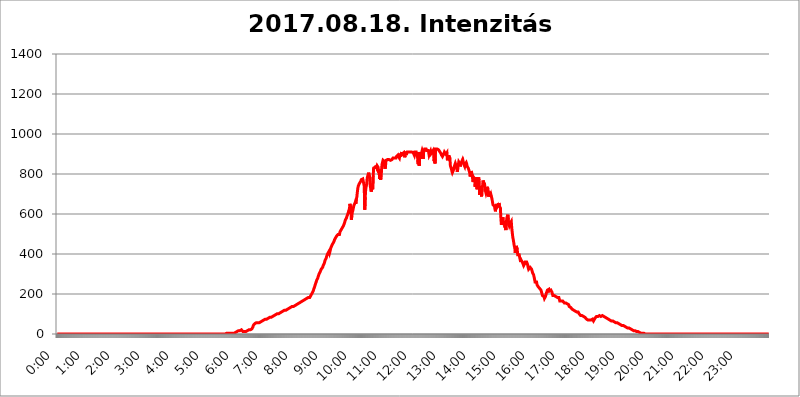
| Category | 2017.08.18. Intenzitás [W/m^2] |
|---|---|
| 0.0 | 0 |
| 0.0006944444444444445 | 0 |
| 0.001388888888888889 | 0 |
| 0.0020833333333333333 | 0 |
| 0.002777777777777778 | 0 |
| 0.003472222222222222 | 0 |
| 0.004166666666666667 | 0 |
| 0.004861111111111111 | 0 |
| 0.005555555555555556 | 0 |
| 0.0062499999999999995 | 0 |
| 0.006944444444444444 | 0 |
| 0.007638888888888889 | 0 |
| 0.008333333333333333 | 0 |
| 0.009027777777777779 | 0 |
| 0.009722222222222222 | 0 |
| 0.010416666666666666 | 0 |
| 0.011111111111111112 | 0 |
| 0.011805555555555555 | 0 |
| 0.012499999999999999 | 0 |
| 0.013194444444444444 | 0 |
| 0.013888888888888888 | 0 |
| 0.014583333333333332 | 0 |
| 0.015277777777777777 | 0 |
| 0.015972222222222224 | 0 |
| 0.016666666666666666 | 0 |
| 0.017361111111111112 | 0 |
| 0.018055555555555557 | 0 |
| 0.01875 | 0 |
| 0.019444444444444445 | 0 |
| 0.02013888888888889 | 0 |
| 0.020833333333333332 | 0 |
| 0.02152777777777778 | 0 |
| 0.022222222222222223 | 0 |
| 0.02291666666666667 | 0 |
| 0.02361111111111111 | 0 |
| 0.024305555555555556 | 0 |
| 0.024999999999999998 | 0 |
| 0.025694444444444447 | 0 |
| 0.02638888888888889 | 0 |
| 0.027083333333333334 | 0 |
| 0.027777777777777776 | 0 |
| 0.02847222222222222 | 0 |
| 0.029166666666666664 | 0 |
| 0.029861111111111113 | 0 |
| 0.030555555555555555 | 0 |
| 0.03125 | 0 |
| 0.03194444444444445 | 0 |
| 0.03263888888888889 | 0 |
| 0.03333333333333333 | 0 |
| 0.034027777777777775 | 0 |
| 0.034722222222222224 | 0 |
| 0.035416666666666666 | 0 |
| 0.036111111111111115 | 0 |
| 0.03680555555555556 | 0 |
| 0.0375 | 0 |
| 0.03819444444444444 | 0 |
| 0.03888888888888889 | 0 |
| 0.03958333333333333 | 0 |
| 0.04027777777777778 | 0 |
| 0.04097222222222222 | 0 |
| 0.041666666666666664 | 0 |
| 0.042361111111111106 | 0 |
| 0.04305555555555556 | 0 |
| 0.043750000000000004 | 0 |
| 0.044444444444444446 | 0 |
| 0.04513888888888889 | 0 |
| 0.04583333333333334 | 0 |
| 0.04652777777777778 | 0 |
| 0.04722222222222222 | 0 |
| 0.04791666666666666 | 0 |
| 0.04861111111111111 | 0 |
| 0.049305555555555554 | 0 |
| 0.049999999999999996 | 0 |
| 0.05069444444444445 | 0 |
| 0.051388888888888894 | 0 |
| 0.052083333333333336 | 0 |
| 0.05277777777777778 | 0 |
| 0.05347222222222222 | 0 |
| 0.05416666666666667 | 0 |
| 0.05486111111111111 | 0 |
| 0.05555555555555555 | 0 |
| 0.05625 | 0 |
| 0.05694444444444444 | 0 |
| 0.057638888888888885 | 0 |
| 0.05833333333333333 | 0 |
| 0.05902777777777778 | 0 |
| 0.059722222222222225 | 0 |
| 0.06041666666666667 | 0 |
| 0.061111111111111116 | 0 |
| 0.06180555555555556 | 0 |
| 0.0625 | 0 |
| 0.06319444444444444 | 0 |
| 0.06388888888888888 | 0 |
| 0.06458333333333334 | 0 |
| 0.06527777777777778 | 0 |
| 0.06597222222222222 | 0 |
| 0.06666666666666667 | 0 |
| 0.06736111111111111 | 0 |
| 0.06805555555555555 | 0 |
| 0.06874999999999999 | 0 |
| 0.06944444444444443 | 0 |
| 0.07013888888888889 | 0 |
| 0.07083333333333333 | 0 |
| 0.07152777777777779 | 0 |
| 0.07222222222222223 | 0 |
| 0.07291666666666667 | 0 |
| 0.07361111111111111 | 0 |
| 0.07430555555555556 | 0 |
| 0.075 | 0 |
| 0.07569444444444444 | 0 |
| 0.0763888888888889 | 0 |
| 0.07708333333333334 | 0 |
| 0.07777777777777778 | 0 |
| 0.07847222222222222 | 0 |
| 0.07916666666666666 | 0 |
| 0.0798611111111111 | 0 |
| 0.08055555555555556 | 0 |
| 0.08125 | 0 |
| 0.08194444444444444 | 0 |
| 0.08263888888888889 | 0 |
| 0.08333333333333333 | 0 |
| 0.08402777777777777 | 0 |
| 0.08472222222222221 | 0 |
| 0.08541666666666665 | 0 |
| 0.08611111111111112 | 0 |
| 0.08680555555555557 | 0 |
| 0.08750000000000001 | 0 |
| 0.08819444444444445 | 0 |
| 0.08888888888888889 | 0 |
| 0.08958333333333333 | 0 |
| 0.09027777777777778 | 0 |
| 0.09097222222222222 | 0 |
| 0.09166666666666667 | 0 |
| 0.09236111111111112 | 0 |
| 0.09305555555555556 | 0 |
| 0.09375 | 0 |
| 0.09444444444444444 | 0 |
| 0.09513888888888888 | 0 |
| 0.09583333333333333 | 0 |
| 0.09652777777777777 | 0 |
| 0.09722222222222222 | 0 |
| 0.09791666666666667 | 0 |
| 0.09861111111111111 | 0 |
| 0.09930555555555555 | 0 |
| 0.09999999999999999 | 0 |
| 0.10069444444444443 | 0 |
| 0.1013888888888889 | 0 |
| 0.10208333333333335 | 0 |
| 0.10277777777777779 | 0 |
| 0.10347222222222223 | 0 |
| 0.10416666666666667 | 0 |
| 0.10486111111111111 | 0 |
| 0.10555555555555556 | 0 |
| 0.10625 | 0 |
| 0.10694444444444444 | 0 |
| 0.1076388888888889 | 0 |
| 0.10833333333333334 | 0 |
| 0.10902777777777778 | 0 |
| 0.10972222222222222 | 0 |
| 0.1111111111111111 | 0 |
| 0.11180555555555556 | 0 |
| 0.11180555555555556 | 0 |
| 0.1125 | 0 |
| 0.11319444444444444 | 0 |
| 0.11388888888888889 | 0 |
| 0.11458333333333333 | 0 |
| 0.11527777777777777 | 0 |
| 0.11597222222222221 | 0 |
| 0.11666666666666665 | 0 |
| 0.1173611111111111 | 0 |
| 0.11805555555555557 | 0 |
| 0.11944444444444445 | 0 |
| 0.12013888888888889 | 0 |
| 0.12083333333333333 | 0 |
| 0.12152777777777778 | 0 |
| 0.12222222222222223 | 0 |
| 0.12291666666666667 | 0 |
| 0.12291666666666667 | 0 |
| 0.12361111111111112 | 0 |
| 0.12430555555555556 | 0 |
| 0.125 | 0 |
| 0.12569444444444444 | 0 |
| 0.12638888888888888 | 0 |
| 0.12708333333333333 | 0 |
| 0.16875 | 0 |
| 0.12847222222222224 | 0 |
| 0.12916666666666668 | 0 |
| 0.12986111111111112 | 0 |
| 0.13055555555555556 | 0 |
| 0.13125 | 0 |
| 0.13194444444444445 | 0 |
| 0.1326388888888889 | 0 |
| 0.13333333333333333 | 0 |
| 0.13402777777777777 | 0 |
| 0.13402777777777777 | 0 |
| 0.13472222222222222 | 0 |
| 0.13541666666666666 | 0 |
| 0.1361111111111111 | 0 |
| 0.13749999999999998 | 0 |
| 0.13819444444444443 | 0 |
| 0.1388888888888889 | 0 |
| 0.13958333333333334 | 0 |
| 0.14027777777777778 | 0 |
| 0.14097222222222222 | 0 |
| 0.14166666666666666 | 0 |
| 0.1423611111111111 | 0 |
| 0.14305555555555557 | 0 |
| 0.14375000000000002 | 0 |
| 0.14444444444444446 | 0 |
| 0.1451388888888889 | 0 |
| 0.1451388888888889 | 0 |
| 0.14652777777777778 | 0 |
| 0.14722222222222223 | 0 |
| 0.14791666666666667 | 0 |
| 0.1486111111111111 | 0 |
| 0.14930555555555555 | 0 |
| 0.15 | 0 |
| 0.15069444444444444 | 0 |
| 0.15138888888888888 | 0 |
| 0.15208333333333332 | 0 |
| 0.15277777777777776 | 0 |
| 0.15347222222222223 | 0 |
| 0.15416666666666667 | 0 |
| 0.15486111111111112 | 0 |
| 0.15555555555555556 | 0 |
| 0.15625 | 0 |
| 0.15694444444444444 | 0 |
| 0.15763888888888888 | 0 |
| 0.15833333333333333 | 0 |
| 0.15902777777777777 | 0 |
| 0.15972222222222224 | 0 |
| 0.16041666666666668 | 0 |
| 0.16111111111111112 | 0 |
| 0.16180555555555556 | 0 |
| 0.1625 | 0 |
| 0.16319444444444445 | 0 |
| 0.1638888888888889 | 0 |
| 0.16458333333333333 | 0 |
| 0.16527777777777777 | 0 |
| 0.16597222222222222 | 0 |
| 0.16666666666666666 | 0 |
| 0.1673611111111111 | 0 |
| 0.16805555555555554 | 0 |
| 0.16874999999999998 | 0 |
| 0.16944444444444443 | 0 |
| 0.17013888888888887 | 0 |
| 0.1708333333333333 | 0 |
| 0.17152777777777775 | 0 |
| 0.17222222222222225 | 0 |
| 0.1729166666666667 | 0 |
| 0.17361111111111113 | 0 |
| 0.17430555555555557 | 0 |
| 0.17500000000000002 | 0 |
| 0.17569444444444446 | 0 |
| 0.1763888888888889 | 0 |
| 0.17708333333333334 | 0 |
| 0.17777777777777778 | 0 |
| 0.17847222222222223 | 0 |
| 0.17916666666666667 | 0 |
| 0.1798611111111111 | 0 |
| 0.18055555555555555 | 0 |
| 0.18125 | 0 |
| 0.18194444444444444 | 0 |
| 0.1826388888888889 | 0 |
| 0.18333333333333335 | 0 |
| 0.1840277777777778 | 0 |
| 0.18472222222222223 | 0 |
| 0.18541666666666667 | 0 |
| 0.18611111111111112 | 0 |
| 0.18680555555555556 | 0 |
| 0.1875 | 0 |
| 0.18819444444444444 | 0 |
| 0.18888888888888888 | 0 |
| 0.18958333333333333 | 0 |
| 0.19027777777777777 | 0 |
| 0.1909722222222222 | 0 |
| 0.19166666666666665 | 0 |
| 0.19236111111111112 | 0 |
| 0.19305555555555554 | 0 |
| 0.19375 | 0 |
| 0.19444444444444445 | 0 |
| 0.1951388888888889 | 0 |
| 0.19583333333333333 | 0 |
| 0.19652777777777777 | 0 |
| 0.19722222222222222 | 0 |
| 0.19791666666666666 | 0 |
| 0.1986111111111111 | 0 |
| 0.19930555555555554 | 0 |
| 0.19999999999999998 | 0 |
| 0.20069444444444443 | 0 |
| 0.20138888888888887 | 0 |
| 0.2020833333333333 | 0 |
| 0.2027777777777778 | 0 |
| 0.2034722222222222 | 0 |
| 0.2041666666666667 | 0 |
| 0.20486111111111113 | 0 |
| 0.20555555555555557 | 0 |
| 0.20625000000000002 | 0 |
| 0.20694444444444446 | 0 |
| 0.2076388888888889 | 0 |
| 0.20833333333333334 | 0 |
| 0.20902777777777778 | 0 |
| 0.20972222222222223 | 0 |
| 0.21041666666666667 | 0 |
| 0.2111111111111111 | 0 |
| 0.21180555555555555 | 0 |
| 0.2125 | 0 |
| 0.21319444444444444 | 0 |
| 0.2138888888888889 | 0 |
| 0.21458333333333335 | 0 |
| 0.2152777777777778 | 0 |
| 0.21597222222222223 | 0 |
| 0.21666666666666667 | 0 |
| 0.21736111111111112 | 0 |
| 0.21805555555555556 | 0 |
| 0.21875 | 0 |
| 0.21944444444444444 | 0 |
| 0.22013888888888888 | 0 |
| 0.22083333333333333 | 0 |
| 0.22152777777777777 | 0 |
| 0.2222222222222222 | 0 |
| 0.22291666666666665 | 0 |
| 0.2236111111111111 | 0 |
| 0.22430555555555556 | 0 |
| 0.225 | 0 |
| 0.22569444444444445 | 0 |
| 0.2263888888888889 | 0 |
| 0.22708333333333333 | 0 |
| 0.22777777777777777 | 0 |
| 0.22847222222222222 | 0 |
| 0.22916666666666666 | 0 |
| 0.2298611111111111 | 0 |
| 0.23055555555555554 | 0 |
| 0.23124999999999998 | 0 |
| 0.23194444444444443 | 0 |
| 0.23263888888888887 | 0 |
| 0.2333333333333333 | 0 |
| 0.2340277777777778 | 0 |
| 0.2347222222222222 | 0 |
| 0.2354166666666667 | 0 |
| 0.23611111111111113 | 0 |
| 0.23680555555555557 | 0 |
| 0.23750000000000002 | 3.525 |
| 0.23819444444444446 | 3.525 |
| 0.2388888888888889 | 3.525 |
| 0.23958333333333334 | 3.525 |
| 0.24027777777777778 | 3.525 |
| 0.24097222222222223 | 3.525 |
| 0.24166666666666667 | 3.525 |
| 0.2423611111111111 | 3.525 |
| 0.24305555555555555 | 3.525 |
| 0.24375 | 3.525 |
| 0.24444444444444446 | 3.525 |
| 0.24513888888888888 | 3.525 |
| 0.24583333333333335 | 3.525 |
| 0.2465277777777778 | 3.525 |
| 0.24722222222222223 | 3.525 |
| 0.24791666666666667 | 3.525 |
| 0.24861111111111112 | 7.887 |
| 0.24930555555555556 | 7.887 |
| 0.25 | 7.887 |
| 0.25069444444444444 | 12.257 |
| 0.2513888888888889 | 12.257 |
| 0.2520833333333333 | 12.257 |
| 0.25277777777777777 | 12.257 |
| 0.2534722222222222 | 12.257 |
| 0.25416666666666665 | 16.636 |
| 0.2548611111111111 | 16.636 |
| 0.2555555555555556 | 16.636 |
| 0.25625000000000003 | 16.636 |
| 0.2569444444444445 | 16.636 |
| 0.2576388888888889 | 21.024 |
| 0.25833333333333336 | 21.024 |
| 0.2590277777777778 | 21.024 |
| 0.25972222222222224 | 16.636 |
| 0.2604166666666667 | 12.257 |
| 0.2611111111111111 | 12.257 |
| 0.26180555555555557 | 12.257 |
| 0.2625 | 12.257 |
| 0.26319444444444445 | 12.257 |
| 0.2638888888888889 | 12.257 |
| 0.26458333333333334 | 12.257 |
| 0.2652777777777778 | 16.636 |
| 0.2659722222222222 | 16.636 |
| 0.26666666666666666 | 16.636 |
| 0.2673611111111111 | 16.636 |
| 0.26805555555555555 | 21.024 |
| 0.26875 | 21.024 |
| 0.26944444444444443 | 21.024 |
| 0.2701388888888889 | 21.024 |
| 0.2708333333333333 | 21.024 |
| 0.27152777777777776 | 21.024 |
| 0.2722222222222222 | 21.024 |
| 0.27291666666666664 | 25.419 |
| 0.2736111111111111 | 29.823 |
| 0.2743055555555555 | 34.234 |
| 0.27499999999999997 | 43.079 |
| 0.27569444444444446 | 47.511 |
| 0.27638888888888885 | 47.511 |
| 0.27708333333333335 | 51.951 |
| 0.2777777777777778 | 51.951 |
| 0.27847222222222223 | 51.951 |
| 0.2791666666666667 | 56.398 |
| 0.2798611111111111 | 56.398 |
| 0.28055555555555556 | 56.398 |
| 0.28125 | 56.398 |
| 0.28194444444444444 | 56.398 |
| 0.2826388888888889 | 60.85 |
| 0.2833333333333333 | 56.398 |
| 0.28402777777777777 | 56.398 |
| 0.2847222222222222 | 56.398 |
| 0.28541666666666665 | 60.85 |
| 0.28611111111111115 | 60.85 |
| 0.28680555555555554 | 65.31 |
| 0.28750000000000003 | 65.31 |
| 0.2881944444444445 | 69.775 |
| 0.2888888888888889 | 69.775 |
| 0.28958333333333336 | 69.775 |
| 0.2902777777777778 | 69.775 |
| 0.29097222222222224 | 74.246 |
| 0.2916666666666667 | 74.246 |
| 0.2923611111111111 | 74.246 |
| 0.29305555555555557 | 74.246 |
| 0.29375 | 74.246 |
| 0.29444444444444445 | 78.722 |
| 0.2951388888888889 | 78.722 |
| 0.29583333333333334 | 78.722 |
| 0.2965277777777778 | 78.722 |
| 0.2972222222222222 | 83.205 |
| 0.29791666666666666 | 83.205 |
| 0.2986111111111111 | 83.205 |
| 0.29930555555555555 | 83.205 |
| 0.3 | 83.205 |
| 0.30069444444444443 | 87.692 |
| 0.3013888888888889 | 87.692 |
| 0.3020833333333333 | 87.692 |
| 0.30277777777777776 | 92.184 |
| 0.3034722222222222 | 92.184 |
| 0.30416666666666664 | 92.184 |
| 0.3048611111111111 | 92.184 |
| 0.3055555555555555 | 96.682 |
| 0.30624999999999997 | 96.682 |
| 0.3069444444444444 | 96.682 |
| 0.3076388888888889 | 96.682 |
| 0.30833333333333335 | 101.184 |
| 0.3090277777777778 | 101.184 |
| 0.30972222222222223 | 101.184 |
| 0.3104166666666667 | 101.184 |
| 0.3111111111111111 | 105.69 |
| 0.31180555555555556 | 105.69 |
| 0.3125 | 105.69 |
| 0.31319444444444444 | 105.69 |
| 0.3138888888888889 | 110.201 |
| 0.3145833333333333 | 110.201 |
| 0.31527777777777777 | 110.201 |
| 0.3159722222222222 | 110.201 |
| 0.31666666666666665 | 114.716 |
| 0.31736111111111115 | 114.716 |
| 0.31805555555555554 | 114.716 |
| 0.31875000000000003 | 119.235 |
| 0.3194444444444445 | 119.235 |
| 0.3201388888888889 | 119.235 |
| 0.32083333333333336 | 119.235 |
| 0.3215277777777778 | 123.758 |
| 0.32222222222222224 | 123.758 |
| 0.3229166666666667 | 123.758 |
| 0.3236111111111111 | 128.284 |
| 0.32430555555555557 | 128.284 |
| 0.325 | 128.284 |
| 0.32569444444444445 | 132.814 |
| 0.3263888888888889 | 132.814 |
| 0.32708333333333334 | 132.814 |
| 0.3277777777777778 | 132.814 |
| 0.3284722222222222 | 137.347 |
| 0.32916666666666666 | 137.347 |
| 0.3298611111111111 | 137.347 |
| 0.33055555555555555 | 137.347 |
| 0.33125 | 137.347 |
| 0.33194444444444443 | 141.884 |
| 0.3326388888888889 | 141.884 |
| 0.3333333333333333 | 141.884 |
| 0.3340277777777778 | 146.423 |
| 0.3347222222222222 | 146.423 |
| 0.3354166666666667 | 146.423 |
| 0.3361111111111111 | 146.423 |
| 0.3368055555555556 | 150.964 |
| 0.33749999999999997 | 150.964 |
| 0.33819444444444446 | 150.964 |
| 0.33888888888888885 | 155.509 |
| 0.33958333333333335 | 155.509 |
| 0.34027777777777773 | 155.509 |
| 0.34097222222222223 | 160.056 |
| 0.3416666666666666 | 160.056 |
| 0.3423611111111111 | 160.056 |
| 0.3430555555555555 | 164.605 |
| 0.34375 | 164.605 |
| 0.3444444444444445 | 164.605 |
| 0.3451388888888889 | 169.156 |
| 0.3458333333333334 | 169.156 |
| 0.34652777777777777 | 173.709 |
| 0.34722222222222227 | 173.709 |
| 0.34791666666666665 | 173.709 |
| 0.34861111111111115 | 173.709 |
| 0.34930555555555554 | 178.264 |
| 0.35000000000000003 | 178.264 |
| 0.3506944444444444 | 178.264 |
| 0.3513888888888889 | 182.82 |
| 0.3520833333333333 | 182.82 |
| 0.3527777777777778 | 182.82 |
| 0.3534722222222222 | 182.82 |
| 0.3541666666666667 | 182.82 |
| 0.3548611111111111 | 182.82 |
| 0.35555555555555557 | 187.378 |
| 0.35625 | 196.497 |
| 0.35694444444444445 | 201.058 |
| 0.3576388888888889 | 205.62 |
| 0.35833333333333334 | 210.182 |
| 0.3590277777777778 | 214.746 |
| 0.3597222222222222 | 223.873 |
| 0.36041666666666666 | 228.436 |
| 0.3611111111111111 | 237.564 |
| 0.36180555555555555 | 246.689 |
| 0.3625 | 251.251 |
| 0.36319444444444443 | 260.373 |
| 0.3638888888888889 | 269.49 |
| 0.3645833333333333 | 274.047 |
| 0.3652777777777778 | 278.603 |
| 0.3659722222222222 | 287.709 |
| 0.3666666666666667 | 292.259 |
| 0.3673611111111111 | 301.354 |
| 0.3680555555555556 | 305.898 |
| 0.36874999999999997 | 310.44 |
| 0.36944444444444446 | 314.98 |
| 0.37013888888888885 | 324.052 |
| 0.37083333333333335 | 324.052 |
| 0.37152777777777773 | 328.584 |
| 0.37222222222222223 | 333.113 |
| 0.3729166666666666 | 342.162 |
| 0.3736111111111111 | 346.682 |
| 0.3743055555555555 | 351.198 |
| 0.375 | 360.221 |
| 0.3756944444444445 | 369.23 |
| 0.3763888888888889 | 373.729 |
| 0.3770833333333334 | 378.224 |
| 0.37777777777777777 | 387.202 |
| 0.37847222222222227 | 391.685 |
| 0.37916666666666665 | 400.638 |
| 0.37986111111111115 | 405.108 |
| 0.38055555555555554 | 405.108 |
| 0.38125000000000003 | 414.035 |
| 0.3819444444444444 | 405.108 |
| 0.3826388888888889 | 414.035 |
| 0.3833333333333333 | 427.39 |
| 0.3840277777777778 | 427.39 |
| 0.3847222222222222 | 431.833 |
| 0.3854166666666667 | 445.129 |
| 0.3861111111111111 | 449.551 |
| 0.38680555555555557 | 453.968 |
| 0.3875 | 458.38 |
| 0.38819444444444445 | 462.786 |
| 0.3888888888888889 | 471.582 |
| 0.38958333333333334 | 471.582 |
| 0.3902777777777778 | 480.356 |
| 0.3909722222222222 | 484.735 |
| 0.39166666666666666 | 489.108 |
| 0.3923611111111111 | 489.108 |
| 0.39305555555555555 | 493.475 |
| 0.39375 | 497.836 |
| 0.39444444444444443 | 502.192 |
| 0.3951388888888889 | 502.192 |
| 0.3958333333333333 | 497.836 |
| 0.3965277777777778 | 510.885 |
| 0.3972222222222222 | 515.223 |
| 0.3979166666666667 | 519.555 |
| 0.3986111111111111 | 523.88 |
| 0.3993055555555556 | 523.88 |
| 0.39999999999999997 | 532.513 |
| 0.40069444444444446 | 536.82 |
| 0.40138888888888885 | 541.121 |
| 0.40208333333333335 | 545.416 |
| 0.40277777777777773 | 553.986 |
| 0.40347222222222223 | 562.53 |
| 0.4041666666666666 | 571.049 |
| 0.4048611111111111 | 571.049 |
| 0.4055555555555555 | 579.542 |
| 0.40625 | 588.009 |
| 0.4069444444444445 | 592.233 |
| 0.4076388888888889 | 600.661 |
| 0.4083333333333334 | 609.062 |
| 0.40902777777777777 | 600.661 |
| 0.40972222222222227 | 617.436 |
| 0.41041666666666665 | 650.667 |
| 0.41111111111111115 | 642.4 |
| 0.41180555555555554 | 634.105 |
| 0.41250000000000003 | 571.049 |
| 0.4131944444444444 | 592.233 |
| 0.4138888888888889 | 609.062 |
| 0.4145833333333333 | 617.436 |
| 0.4152777777777778 | 621.613 |
| 0.4159722222222222 | 642.4 |
| 0.4166666666666667 | 642.4 |
| 0.4173611111111111 | 638.256 |
| 0.41805555555555557 | 658.909 |
| 0.41875 | 650.667 |
| 0.41944444444444445 | 675.311 |
| 0.4201388888888889 | 683.473 |
| 0.42083333333333334 | 707.8 |
| 0.4215277777777778 | 727.896 |
| 0.4222222222222222 | 739.877 |
| 0.42291666666666666 | 743.859 |
| 0.4236111111111111 | 751.803 |
| 0.42430555555555555 | 751.803 |
| 0.425 | 755.766 |
| 0.42569444444444443 | 763.674 |
| 0.4263888888888889 | 771.559 |
| 0.4270833333333333 | 771.559 |
| 0.4277777777777778 | 767.62 |
| 0.4284722222222222 | 775.492 |
| 0.4291666666666667 | 779.42 |
| 0.4298611111111111 | 771.559 |
| 0.4305555555555556 | 739.877 |
| 0.43124999999999997 | 621.613 |
| 0.43194444444444446 | 683.473 |
| 0.43263888888888885 | 723.889 |
| 0.43333333333333335 | 723.889 |
| 0.43402777777777773 | 751.803 |
| 0.43472222222222223 | 779.42 |
| 0.4354166666666666 | 783.342 |
| 0.4361111111111111 | 798.974 |
| 0.4368055555555555 | 806.757 |
| 0.4375 | 802.868 |
| 0.4381944444444445 | 779.42 |
| 0.4388888888888889 | 743.859 |
| 0.4395833333333334 | 739.877 |
| 0.44027777777777777 | 711.832 |
| 0.44097222222222227 | 711.832 |
| 0.44166666666666665 | 731.896 |
| 0.44236111111111115 | 723.889 |
| 0.44305555555555554 | 787.258 |
| 0.44375000000000003 | 829.981 |
| 0.4444444444444444 | 826.123 |
| 0.4451388888888889 | 833.834 |
| 0.4458333333333333 | 833.834 |
| 0.4465277777777778 | 826.123 |
| 0.4472222222222222 | 841.526 |
| 0.4479166666666667 | 833.834 |
| 0.4486111111111111 | 841.526 |
| 0.44930555555555557 | 845.365 |
| 0.45 | 833.834 |
| 0.45069444444444445 | 806.757 |
| 0.4513888888888889 | 822.26 |
| 0.45208333333333334 | 775.492 |
| 0.4527777777777778 | 795.074 |
| 0.4534722222222222 | 771.559 |
| 0.45416666666666666 | 779.42 |
| 0.4548611111111111 | 822.26 |
| 0.45555555555555555 | 849.199 |
| 0.45625 | 853.029 |
| 0.45694444444444443 | 868.305 |
| 0.4576388888888889 | 868.305 |
| 0.4583333333333333 | 864.493 |
| 0.4590277777777778 | 860.676 |
| 0.4597222222222222 | 826.123 |
| 0.4604166666666667 | 841.526 |
| 0.4611111111111111 | 868.305 |
| 0.4618055555555556 | 872.114 |
| 0.46249999999999997 | 872.114 |
| 0.46319444444444446 | 872.114 |
| 0.46388888888888885 | 872.114 |
| 0.46458333333333335 | 872.114 |
| 0.46527777777777773 | 872.114 |
| 0.46597222222222223 | 872.114 |
| 0.4666666666666666 | 872.114 |
| 0.4673611111111111 | 868.305 |
| 0.4680555555555555 | 864.493 |
| 0.46875 | 868.305 |
| 0.4694444444444445 | 872.114 |
| 0.4701388888888889 | 872.114 |
| 0.4708333333333334 | 879.719 |
| 0.47152777777777777 | 879.719 |
| 0.47222222222222227 | 879.719 |
| 0.47291666666666665 | 879.719 |
| 0.47361111111111115 | 883.516 |
| 0.47430555555555554 | 883.516 |
| 0.47500000000000003 | 879.719 |
| 0.4756944444444444 | 887.309 |
| 0.4763888888888889 | 887.309 |
| 0.4770833333333333 | 891.099 |
| 0.4777777777777778 | 894.885 |
| 0.4784722222222222 | 887.309 |
| 0.4791666666666667 | 883.516 |
| 0.4798611111111111 | 879.719 |
| 0.48055555555555557 | 894.885 |
| 0.48125 | 887.309 |
| 0.48194444444444445 | 902.447 |
| 0.4826388888888889 | 894.885 |
| 0.48333333333333334 | 909.996 |
| 0.4840277777777778 | 898.668 |
| 0.4847222222222222 | 898.668 |
| 0.48541666666666666 | 898.668 |
| 0.4861111111111111 | 906.223 |
| 0.48680555555555555 | 898.668 |
| 0.4875 | 883.516 |
| 0.48819444444444443 | 906.223 |
| 0.4888888888888889 | 906.223 |
| 0.4895833333333333 | 909.996 |
| 0.4902777777777778 | 902.447 |
| 0.4909722222222222 | 909.996 |
| 0.4916666666666667 | 909.996 |
| 0.4923611111111111 | 909.996 |
| 0.4930555555555556 | 909.996 |
| 0.49374999999999997 | 909.996 |
| 0.49444444444444446 | 909.996 |
| 0.49513888888888885 | 909.996 |
| 0.49583333333333335 | 909.996 |
| 0.49652777777777773 | 909.996 |
| 0.49722222222222223 | 909.996 |
| 0.4979166666666666 | 909.996 |
| 0.4986111111111111 | 909.996 |
| 0.4993055555555555 | 906.223 |
| 0.5 | 902.447 |
| 0.5006944444444444 | 894.885 |
| 0.5013888888888889 | 909.996 |
| 0.5020833333333333 | 909.996 |
| 0.5027777777777778 | 913.766 |
| 0.5034722222222222 | 909.996 |
| 0.5041666666666667 | 898.668 |
| 0.5048611111111111 | 902.447 |
| 0.5055555555555555 | 909.996 |
| 0.50625 | 849.199 |
| 0.5069444444444444 | 906.223 |
| 0.5076388888888889 | 841.526 |
| 0.5083333333333333 | 894.885 |
| 0.5090277777777777 | 909.996 |
| 0.5097222222222222 | 875.918 |
| 0.5104166666666666 | 898.668 |
| 0.5111111111111112 | 898.668 |
| 0.5118055555555555 | 917.534 |
| 0.5125000000000001 | 909.996 |
| 0.5131944444444444 | 875.918 |
| 0.513888888888889 | 909.996 |
| 0.5145833333333333 | 917.534 |
| 0.5152777777777778 | 925.06 |
| 0.5159722222222222 | 928.819 |
| 0.5166666666666667 | 925.06 |
| 0.517361111111111 | 925.06 |
| 0.5180555555555556 | 917.534 |
| 0.5187499999999999 | 921.298 |
| 0.5194444444444445 | 917.534 |
| 0.5201388888888888 | 917.534 |
| 0.5208333333333334 | 909.996 |
| 0.5215277777777778 | 894.885 |
| 0.5222222222222223 | 898.668 |
| 0.5229166666666667 | 894.885 |
| 0.5236111111111111 | 913.766 |
| 0.5243055555555556 | 902.447 |
| 0.525 | 902.447 |
| 0.5256944444444445 | 909.996 |
| 0.5263888888888889 | 913.766 |
| 0.5270833333333333 | 917.534 |
| 0.5277777777777778 | 902.447 |
| 0.5284722222222222 | 864.493 |
| 0.5291666666666667 | 879.719 |
| 0.5298611111111111 | 853.029 |
| 0.5305555555555556 | 925.06 |
| 0.53125 | 928.819 |
| 0.5319444444444444 | 921.298 |
| 0.5326388888888889 | 925.06 |
| 0.5333333333333333 | 925.06 |
| 0.5340277777777778 | 925.06 |
| 0.5347222222222222 | 921.298 |
| 0.5354166666666667 | 917.534 |
| 0.5361111111111111 | 913.766 |
| 0.5368055555555555 | 909.996 |
| 0.5375 | 909.996 |
| 0.5381944444444444 | 902.447 |
| 0.5388888888888889 | 894.885 |
| 0.5395833333333333 | 894.885 |
| 0.5402777777777777 | 887.309 |
| 0.5409722222222222 | 883.516 |
| 0.5416666666666666 | 891.099 |
| 0.5423611111111112 | 902.447 |
| 0.5430555555555555 | 909.996 |
| 0.5437500000000001 | 909.996 |
| 0.5444444444444444 | 906.223 |
| 0.545138888888889 | 898.668 |
| 0.5458333333333333 | 898.668 |
| 0.5465277777777778 | 906.223 |
| 0.5472222222222222 | 868.305 |
| 0.5479166666666667 | 887.309 |
| 0.548611111111111 | 891.099 |
| 0.5493055555555556 | 887.309 |
| 0.5499999999999999 | 887.309 |
| 0.5506944444444445 | 879.719 |
| 0.5513888888888888 | 841.526 |
| 0.5520833333333334 | 837.682 |
| 0.5527777777777778 | 826.123 |
| 0.5534722222222223 | 814.519 |
| 0.5541666666666667 | 806.757 |
| 0.5548611111111111 | 802.868 |
| 0.5555555555555556 | 818.392 |
| 0.55625 | 826.123 |
| 0.5569444444444445 | 837.682 |
| 0.5576388888888889 | 841.526 |
| 0.5583333333333333 | 853.029 |
| 0.5590277777777778 | 845.365 |
| 0.5597222222222222 | 845.365 |
| 0.5604166666666667 | 833.834 |
| 0.5611111111111111 | 810.641 |
| 0.5618055555555556 | 829.981 |
| 0.5625 | 845.365 |
| 0.5631944444444444 | 860.676 |
| 0.5638888888888889 | 860.676 |
| 0.5645833333333333 | 853.029 |
| 0.5652777777777778 | 837.682 |
| 0.5659722222222222 | 849.199 |
| 0.5666666666666667 | 856.855 |
| 0.5673611111111111 | 856.855 |
| 0.5680555555555555 | 868.305 |
| 0.56875 | 853.029 |
| 0.5694444444444444 | 860.676 |
| 0.5701388888888889 | 849.199 |
| 0.5708333333333333 | 849.199 |
| 0.5715277777777777 | 837.682 |
| 0.5722222222222222 | 849.199 |
| 0.5729166666666666 | 845.365 |
| 0.5736111111111112 | 856.855 |
| 0.5743055555555555 | 849.199 |
| 0.5750000000000001 | 837.682 |
| 0.5756944444444444 | 837.682 |
| 0.576388888888889 | 829.981 |
| 0.5770833333333333 | 833.834 |
| 0.5777777777777778 | 826.123 |
| 0.5784722222222222 | 806.757 |
| 0.5791666666666667 | 787.258 |
| 0.579861111111111 | 798.974 |
| 0.5805555555555556 | 814.519 |
| 0.5812499999999999 | 806.757 |
| 0.5819444444444445 | 806.757 |
| 0.5826388888888888 | 802.868 |
| 0.5833333333333334 | 759.723 |
| 0.5840277777777778 | 783.342 |
| 0.5847222222222223 | 783.342 |
| 0.5854166666666667 | 775.492 |
| 0.5861111111111111 | 735.89 |
| 0.5868055555555556 | 767.62 |
| 0.5875 | 747.834 |
| 0.5881944444444445 | 783.342 |
| 0.5888888888888889 | 723.889 |
| 0.5895833333333333 | 759.723 |
| 0.5902777777777778 | 775.492 |
| 0.5909722222222222 | 783.342 |
| 0.5916666666666667 | 767.62 |
| 0.5923611111111111 | 695.666 |
| 0.5930555555555556 | 739.877 |
| 0.59375 | 731.896 |
| 0.5944444444444444 | 731.896 |
| 0.5951388888888889 | 687.544 |
| 0.5958333333333333 | 727.896 |
| 0.5965277777777778 | 739.877 |
| 0.5972222222222222 | 767.62 |
| 0.5979166666666667 | 759.723 |
| 0.5986111111111111 | 755.766 |
| 0.5993055555555555 | 751.803 |
| 0.6 | 723.889 |
| 0.6006944444444444 | 719.877 |
| 0.6013888888888889 | 703.762 |
| 0.6020833333333333 | 711.832 |
| 0.6027777777777777 | 699.717 |
| 0.6034722222222222 | 735.89 |
| 0.6041666666666666 | 739.877 |
| 0.6048611111111112 | 687.544 |
| 0.6055555555555555 | 699.717 |
| 0.6062500000000001 | 711.832 |
| 0.6069444444444444 | 711.832 |
| 0.607638888888889 | 687.544 |
| 0.6083333333333333 | 695.666 |
| 0.6090277777777778 | 695.666 |
| 0.6097222222222222 | 675.311 |
| 0.6104166666666667 | 675.311 |
| 0.611111111111111 | 646.537 |
| 0.6118055555555556 | 642.4 |
| 0.6124999999999999 | 650.667 |
| 0.6131944444444445 | 638.256 |
| 0.6138888888888888 | 642.4 |
| 0.6145833333333334 | 613.252 |
| 0.6152777777777778 | 638.256 |
| 0.6159722222222223 | 650.667 |
| 0.6166666666666667 | 634.105 |
| 0.6173611111111111 | 634.105 |
| 0.6180555555555556 | 642.4 |
| 0.61875 | 634.105 |
| 0.6194444444444445 | 654.791 |
| 0.6201388888888889 | 638.256 |
| 0.6208333333333333 | 642.4 |
| 0.6215277777777778 | 629.948 |
| 0.6222222222222222 | 579.542 |
| 0.6229166666666667 | 545.416 |
| 0.6236111111111111 | 558.261 |
| 0.6243055555555556 | 575.299 |
| 0.625 | 583.779 |
| 0.6256944444444444 | 549.704 |
| 0.6263888888888889 | 562.53 |
| 0.6270833333333333 | 553.986 |
| 0.6277777777777778 | 532.513 |
| 0.6284722222222222 | 541.121 |
| 0.6291666666666667 | 519.555 |
| 0.6298611111111111 | 558.261 |
| 0.6305555555555555 | 579.542 |
| 0.63125 | 588.009 |
| 0.6319444444444444 | 596.45 |
| 0.6326388888888889 | 571.049 |
| 0.6333333333333333 | 549.704 |
| 0.6340277777777777 | 541.121 |
| 0.6347222222222222 | 545.416 |
| 0.6354166666666666 | 553.986 |
| 0.6361111111111112 | 558.261 |
| 0.6368055555555555 | 562.53 |
| 0.6375000000000001 | 528.2 |
| 0.6381944444444444 | 506.542 |
| 0.638888888888889 | 484.735 |
| 0.6395833333333333 | 471.582 |
| 0.6402777777777778 | 471.582 |
| 0.6409722222222222 | 440.702 |
| 0.6416666666666667 | 431.833 |
| 0.642361111111111 | 405.108 |
| 0.6430555555555556 | 422.943 |
| 0.6437499999999999 | 440.702 |
| 0.6444444444444445 | 445.129 |
| 0.6451388888888888 | 422.943 |
| 0.6458333333333334 | 396.164 |
| 0.6465277777777778 | 396.164 |
| 0.6472222222222223 | 391.685 |
| 0.6479166666666667 | 396.164 |
| 0.6486111111111111 | 382.715 |
| 0.6493055555555556 | 387.202 |
| 0.65 | 360.221 |
| 0.6506944444444445 | 369.23 |
| 0.6513888888888889 | 369.23 |
| 0.6520833333333333 | 369.23 |
| 0.6527777777777778 | 355.712 |
| 0.6534722222222222 | 351.198 |
| 0.6541666666666667 | 342.162 |
| 0.6548611111111111 | 342.162 |
| 0.6555555555555556 | 351.198 |
| 0.65625 | 360.221 |
| 0.6569444444444444 | 355.712 |
| 0.6576388888888889 | 355.712 |
| 0.6583333333333333 | 360.221 |
| 0.6590277777777778 | 355.712 |
| 0.6597222222222222 | 346.682 |
| 0.6604166666666667 | 333.113 |
| 0.6611111111111111 | 324.052 |
| 0.6618055555555555 | 324.052 |
| 0.6625 | 324.052 |
| 0.6631944444444444 | 333.113 |
| 0.6638888888888889 | 333.113 |
| 0.6645833333333333 | 333.113 |
| 0.6652777777777777 | 324.052 |
| 0.6659722222222222 | 314.98 |
| 0.6666666666666666 | 305.898 |
| 0.6673611111111111 | 305.898 |
| 0.6680555555555556 | 296.808 |
| 0.6687500000000001 | 292.259 |
| 0.6694444444444444 | 274.047 |
| 0.6701388888888888 | 260.373 |
| 0.6708333333333334 | 255.813 |
| 0.6715277777777778 | 260.373 |
| 0.6722222222222222 | 260.373 |
| 0.6729166666666666 | 246.689 |
| 0.6736111111111112 | 242.127 |
| 0.6743055555555556 | 237.564 |
| 0.6749999999999999 | 233 |
| 0.6756944444444444 | 233 |
| 0.6763888888888889 | 228.436 |
| 0.6770833333333334 | 228.436 |
| 0.6777777777777777 | 233 |
| 0.6784722222222223 | 219.309 |
| 0.6791666666666667 | 210.182 |
| 0.6798611111111111 | 201.058 |
| 0.6805555555555555 | 191.937 |
| 0.68125 | 191.937 |
| 0.6819444444444445 | 187.378 |
| 0.6826388888888889 | 187.378 |
| 0.6833333333333332 | 178.264 |
| 0.6840277777777778 | 182.82 |
| 0.6847222222222222 | 187.378 |
| 0.6854166666666667 | 196.497 |
| 0.686111111111111 | 205.62 |
| 0.6868055555555556 | 210.182 |
| 0.6875 | 219.309 |
| 0.6881944444444444 | 219.309 |
| 0.688888888888889 | 223.873 |
| 0.6895833333333333 | 223.873 |
| 0.6902777777777778 | 214.746 |
| 0.6909722222222222 | 219.309 |
| 0.6916666666666668 | 219.309 |
| 0.6923611111111111 | 219.309 |
| 0.6930555555555555 | 219.309 |
| 0.69375 | 210.182 |
| 0.6944444444444445 | 201.058 |
| 0.6951388888888889 | 191.937 |
| 0.6958333333333333 | 196.497 |
| 0.6965277777777777 | 191.937 |
| 0.6972222222222223 | 191.937 |
| 0.6979166666666666 | 191.937 |
| 0.6986111111111111 | 191.937 |
| 0.6993055555555556 | 187.378 |
| 0.7000000000000001 | 187.378 |
| 0.7006944444444444 | 182.82 |
| 0.7013888888888888 | 182.82 |
| 0.7020833333333334 | 187.378 |
| 0.7027777777777778 | 187.378 |
| 0.7034722222222222 | 182.82 |
| 0.7041666666666666 | 173.709 |
| 0.7048611111111112 | 164.605 |
| 0.7055555555555556 | 169.156 |
| 0.7062499999999999 | 164.605 |
| 0.7069444444444444 | 164.605 |
| 0.7076388888888889 | 160.056 |
| 0.7083333333333334 | 164.605 |
| 0.7090277777777777 | 164.605 |
| 0.7097222222222223 | 160.056 |
| 0.7104166666666667 | 160.056 |
| 0.7111111111111111 | 155.509 |
| 0.7118055555555555 | 155.509 |
| 0.7125 | 155.509 |
| 0.7131944444444445 | 155.509 |
| 0.7138888888888889 | 155.509 |
| 0.7145833333333332 | 155.509 |
| 0.7152777777777778 | 150.964 |
| 0.7159722222222222 | 150.964 |
| 0.7166666666666667 | 146.423 |
| 0.717361111111111 | 146.423 |
| 0.7180555555555556 | 137.347 |
| 0.71875 | 137.347 |
| 0.7194444444444444 | 137.347 |
| 0.720138888888889 | 132.814 |
| 0.7208333333333333 | 132.814 |
| 0.7215277777777778 | 132.814 |
| 0.7222222222222222 | 123.758 |
| 0.7229166666666668 | 123.758 |
| 0.7236111111111111 | 119.235 |
| 0.7243055555555555 | 119.235 |
| 0.725 | 119.235 |
| 0.7256944444444445 | 119.235 |
| 0.7263888888888889 | 114.716 |
| 0.7270833333333333 | 114.716 |
| 0.7277777777777777 | 114.716 |
| 0.7284722222222223 | 110.201 |
| 0.7291666666666666 | 110.201 |
| 0.7298611111111111 | 110.201 |
| 0.7305555555555556 | 110.201 |
| 0.7312500000000001 | 105.69 |
| 0.7319444444444444 | 101.184 |
| 0.7326388888888888 | 101.184 |
| 0.7333333333333334 | 96.682 |
| 0.7340277777777778 | 92.184 |
| 0.7347222222222222 | 87.692 |
| 0.7354166666666666 | 87.692 |
| 0.7361111111111112 | 92.184 |
| 0.7368055555555556 | 92.184 |
| 0.7374999999999999 | 92.184 |
| 0.7381944444444444 | 87.692 |
| 0.7388888888888889 | 87.692 |
| 0.7395833333333334 | 83.205 |
| 0.7402777777777777 | 83.205 |
| 0.7409722222222223 | 83.205 |
| 0.7416666666666667 | 78.722 |
| 0.7423611111111111 | 74.246 |
| 0.7430555555555555 | 74.246 |
| 0.74375 | 69.775 |
| 0.7444444444444445 | 69.775 |
| 0.7451388888888889 | 69.775 |
| 0.7458333333333332 | 69.775 |
| 0.7465277777777778 | 69.775 |
| 0.7472222222222222 | 69.775 |
| 0.7479166666666667 | 65.31 |
| 0.748611111111111 | 69.775 |
| 0.7493055555555556 | 74.246 |
| 0.75 | 74.246 |
| 0.7506944444444444 | 74.246 |
| 0.751388888888889 | 69.775 |
| 0.7520833333333333 | 65.31 |
| 0.7527777777777778 | 65.31 |
| 0.7534722222222222 | 69.775 |
| 0.7541666666666668 | 78.722 |
| 0.7548611111111111 | 83.205 |
| 0.7555555555555555 | 83.205 |
| 0.75625 | 87.692 |
| 0.7569444444444445 | 87.692 |
| 0.7576388888888889 | 87.692 |
| 0.7583333333333333 | 87.692 |
| 0.7590277777777777 | 92.184 |
| 0.7597222222222223 | 92.184 |
| 0.7604166666666666 | 92.184 |
| 0.7611111111111111 | 92.184 |
| 0.7618055555555556 | 92.184 |
| 0.7625000000000001 | 87.692 |
| 0.7631944444444444 | 83.205 |
| 0.7638888888888888 | 87.692 |
| 0.7645833333333334 | 92.184 |
| 0.7652777777777778 | 87.692 |
| 0.7659722222222222 | 87.692 |
| 0.7666666666666666 | 87.692 |
| 0.7673611111111112 | 87.692 |
| 0.7680555555555556 | 83.205 |
| 0.7687499999999999 | 83.205 |
| 0.7694444444444444 | 83.205 |
| 0.7701388888888889 | 83.205 |
| 0.7708333333333334 | 78.722 |
| 0.7715277777777777 | 78.722 |
| 0.7722222222222223 | 78.722 |
| 0.7729166666666667 | 74.246 |
| 0.7736111111111111 | 74.246 |
| 0.7743055555555555 | 69.775 |
| 0.775 | 69.775 |
| 0.7756944444444445 | 65.31 |
| 0.7763888888888889 | 65.31 |
| 0.7770833333333332 | 65.31 |
| 0.7777777777777778 | 65.31 |
| 0.7784722222222222 | 65.31 |
| 0.7791666666666667 | 65.31 |
| 0.779861111111111 | 65.31 |
| 0.7805555555555556 | 60.85 |
| 0.78125 | 60.85 |
| 0.7819444444444444 | 60.85 |
| 0.782638888888889 | 60.85 |
| 0.7833333333333333 | 56.398 |
| 0.7840277777777778 | 56.398 |
| 0.7847222222222222 | 56.398 |
| 0.7854166666666668 | 56.398 |
| 0.7861111111111111 | 51.951 |
| 0.7868055555555555 | 51.951 |
| 0.7875 | 51.951 |
| 0.7881944444444445 | 47.511 |
| 0.7888888888888889 | 47.511 |
| 0.7895833333333333 | 47.511 |
| 0.7902777777777777 | 47.511 |
| 0.7909722222222223 | 47.511 |
| 0.7916666666666666 | 43.079 |
| 0.7923611111111111 | 43.079 |
| 0.7930555555555556 | 43.079 |
| 0.7937500000000001 | 43.079 |
| 0.7944444444444444 | 38.653 |
| 0.7951388888888888 | 38.653 |
| 0.7958333333333334 | 38.653 |
| 0.7965277777777778 | 38.653 |
| 0.7972222222222222 | 38.653 |
| 0.7979166666666666 | 34.234 |
| 0.7986111111111112 | 34.234 |
| 0.7993055555555556 | 34.234 |
| 0.7999999999999999 | 29.823 |
| 0.8006944444444444 | 29.823 |
| 0.8013888888888889 | 29.823 |
| 0.8020833333333334 | 29.823 |
| 0.8027777777777777 | 29.823 |
| 0.8034722222222223 | 25.419 |
| 0.8041666666666667 | 25.419 |
| 0.8048611111111111 | 25.419 |
| 0.8055555555555555 | 21.024 |
| 0.80625 | 21.024 |
| 0.8069444444444445 | 21.024 |
| 0.8076388888888889 | 21.024 |
| 0.8083333333333332 | 16.636 |
| 0.8090277777777778 | 16.636 |
| 0.8097222222222222 | 16.636 |
| 0.8104166666666667 | 16.636 |
| 0.811111111111111 | 12.257 |
| 0.8118055555555556 | 12.257 |
| 0.8125 | 12.257 |
| 0.8131944444444444 | 12.257 |
| 0.813888888888889 | 12.257 |
| 0.8145833333333333 | 12.257 |
| 0.8152777777777778 | 7.887 |
| 0.8159722222222222 | 7.887 |
| 0.8166666666666668 | 7.887 |
| 0.8173611111111111 | 7.887 |
| 0.8180555555555555 | 7.887 |
| 0.81875 | 3.525 |
| 0.8194444444444445 | 3.525 |
| 0.8201388888888889 | 3.525 |
| 0.8208333333333333 | 3.525 |
| 0.8215277777777777 | 3.525 |
| 0.8222222222222223 | 3.525 |
| 0.8229166666666666 | 3.525 |
| 0.8236111111111111 | 0 |
| 0.8243055555555556 | 0 |
| 0.8250000000000001 | 0 |
| 0.8256944444444444 | 0 |
| 0.8263888888888888 | 0 |
| 0.8270833333333334 | 0 |
| 0.8277777777777778 | 0 |
| 0.8284722222222222 | 0 |
| 0.8291666666666666 | 0 |
| 0.8298611111111112 | 0 |
| 0.8305555555555556 | 0 |
| 0.8312499999999999 | 0 |
| 0.8319444444444444 | 0 |
| 0.8326388888888889 | 0 |
| 0.8333333333333334 | 0 |
| 0.8340277777777777 | 0 |
| 0.8347222222222223 | 0 |
| 0.8354166666666667 | 0 |
| 0.8361111111111111 | 0 |
| 0.8368055555555555 | 0 |
| 0.8375 | 0 |
| 0.8381944444444445 | 0 |
| 0.8388888888888889 | 0 |
| 0.8395833333333332 | 0 |
| 0.8402777777777778 | 0 |
| 0.8409722222222222 | 0 |
| 0.8416666666666667 | 0 |
| 0.842361111111111 | 0 |
| 0.8430555555555556 | 0 |
| 0.84375 | 0 |
| 0.8444444444444444 | 0 |
| 0.845138888888889 | 0 |
| 0.8458333333333333 | 0 |
| 0.8465277777777778 | 0 |
| 0.8472222222222222 | 0 |
| 0.8479166666666668 | 0 |
| 0.8486111111111111 | 0 |
| 0.8493055555555555 | 0 |
| 0.85 | 0 |
| 0.8506944444444445 | 0 |
| 0.8513888888888889 | 0 |
| 0.8520833333333333 | 0 |
| 0.8527777777777777 | 0 |
| 0.8534722222222223 | 0 |
| 0.8541666666666666 | 0 |
| 0.8548611111111111 | 0 |
| 0.8555555555555556 | 0 |
| 0.8562500000000001 | 0 |
| 0.8569444444444444 | 0 |
| 0.8576388888888888 | 0 |
| 0.8583333333333334 | 0 |
| 0.8590277777777778 | 0 |
| 0.8597222222222222 | 0 |
| 0.8604166666666666 | 0 |
| 0.8611111111111112 | 0 |
| 0.8618055555555556 | 0 |
| 0.8624999999999999 | 0 |
| 0.8631944444444444 | 0 |
| 0.8638888888888889 | 0 |
| 0.8645833333333334 | 0 |
| 0.8652777777777777 | 0 |
| 0.8659722222222223 | 0 |
| 0.8666666666666667 | 0 |
| 0.8673611111111111 | 0 |
| 0.8680555555555555 | 0 |
| 0.86875 | 0 |
| 0.8694444444444445 | 0 |
| 0.8701388888888889 | 0 |
| 0.8708333333333332 | 0 |
| 0.8715277777777778 | 0 |
| 0.8722222222222222 | 0 |
| 0.8729166666666667 | 0 |
| 0.873611111111111 | 0 |
| 0.8743055555555556 | 0 |
| 0.875 | 0 |
| 0.8756944444444444 | 0 |
| 0.876388888888889 | 0 |
| 0.8770833333333333 | 0 |
| 0.8777777777777778 | 0 |
| 0.8784722222222222 | 0 |
| 0.8791666666666668 | 0 |
| 0.8798611111111111 | 0 |
| 0.8805555555555555 | 0 |
| 0.88125 | 0 |
| 0.8819444444444445 | 0 |
| 0.8826388888888889 | 0 |
| 0.8833333333333333 | 0 |
| 0.8840277777777777 | 0 |
| 0.8847222222222223 | 0 |
| 0.8854166666666666 | 0 |
| 0.8861111111111111 | 0 |
| 0.8868055555555556 | 0 |
| 0.8875000000000001 | 0 |
| 0.8881944444444444 | 0 |
| 0.8888888888888888 | 0 |
| 0.8895833333333334 | 0 |
| 0.8902777777777778 | 0 |
| 0.8909722222222222 | 0 |
| 0.8916666666666666 | 0 |
| 0.8923611111111112 | 0 |
| 0.8930555555555556 | 0 |
| 0.8937499999999999 | 0 |
| 0.8944444444444444 | 0 |
| 0.8951388888888889 | 0 |
| 0.8958333333333334 | 0 |
| 0.8965277777777777 | 0 |
| 0.8972222222222223 | 0 |
| 0.8979166666666667 | 0 |
| 0.8986111111111111 | 0 |
| 0.8993055555555555 | 0 |
| 0.9 | 0 |
| 0.9006944444444445 | 0 |
| 0.9013888888888889 | 0 |
| 0.9020833333333332 | 0 |
| 0.9027777777777778 | 0 |
| 0.9034722222222222 | 0 |
| 0.9041666666666667 | 0 |
| 0.904861111111111 | 0 |
| 0.9055555555555556 | 0 |
| 0.90625 | 0 |
| 0.9069444444444444 | 0 |
| 0.907638888888889 | 0 |
| 0.9083333333333333 | 0 |
| 0.9090277777777778 | 0 |
| 0.9097222222222222 | 0 |
| 0.9104166666666668 | 0 |
| 0.9111111111111111 | 0 |
| 0.9118055555555555 | 0 |
| 0.9125 | 0 |
| 0.9131944444444445 | 0 |
| 0.9138888888888889 | 0 |
| 0.9145833333333333 | 0 |
| 0.9152777777777777 | 0 |
| 0.9159722222222223 | 0 |
| 0.9166666666666666 | 0 |
| 0.9173611111111111 | 0 |
| 0.9180555555555556 | 0 |
| 0.9187500000000001 | 0 |
| 0.9194444444444444 | 0 |
| 0.9201388888888888 | 0 |
| 0.9208333333333334 | 0 |
| 0.9215277777777778 | 0 |
| 0.9222222222222222 | 0 |
| 0.9229166666666666 | 0 |
| 0.9236111111111112 | 0 |
| 0.9243055555555556 | 0 |
| 0.9249999999999999 | 0 |
| 0.9256944444444444 | 0 |
| 0.9263888888888889 | 0 |
| 0.9270833333333334 | 0 |
| 0.9277777777777777 | 0 |
| 0.9284722222222223 | 0 |
| 0.9291666666666667 | 0 |
| 0.9298611111111111 | 0 |
| 0.9305555555555555 | 0 |
| 0.93125 | 0 |
| 0.9319444444444445 | 0 |
| 0.9326388888888889 | 0 |
| 0.9333333333333332 | 0 |
| 0.9340277777777778 | 0 |
| 0.9347222222222222 | 0 |
| 0.9354166666666667 | 0 |
| 0.936111111111111 | 0 |
| 0.9368055555555556 | 0 |
| 0.9375 | 0 |
| 0.9381944444444444 | 0 |
| 0.938888888888889 | 0 |
| 0.9395833333333333 | 0 |
| 0.9402777777777778 | 0 |
| 0.9409722222222222 | 0 |
| 0.9416666666666668 | 0 |
| 0.9423611111111111 | 0 |
| 0.9430555555555555 | 0 |
| 0.94375 | 0 |
| 0.9444444444444445 | 0 |
| 0.9451388888888889 | 0 |
| 0.9458333333333333 | 0 |
| 0.9465277777777777 | 0 |
| 0.9472222222222223 | 0 |
| 0.9479166666666666 | 0 |
| 0.9486111111111111 | 0 |
| 0.9493055555555556 | 0 |
| 0.9500000000000001 | 0 |
| 0.9506944444444444 | 0 |
| 0.9513888888888888 | 0 |
| 0.9520833333333334 | 0 |
| 0.9527777777777778 | 0 |
| 0.9534722222222222 | 0 |
| 0.9541666666666666 | 0 |
| 0.9548611111111112 | 0 |
| 0.9555555555555556 | 0 |
| 0.9562499999999999 | 0 |
| 0.9569444444444444 | 0 |
| 0.9576388888888889 | 0 |
| 0.9583333333333334 | 0 |
| 0.9590277777777777 | 0 |
| 0.9597222222222223 | 0 |
| 0.9604166666666667 | 0 |
| 0.9611111111111111 | 0 |
| 0.9618055555555555 | 0 |
| 0.9625 | 0 |
| 0.9631944444444445 | 0 |
| 0.9638888888888889 | 0 |
| 0.9645833333333332 | 0 |
| 0.9652777777777778 | 0 |
| 0.9659722222222222 | 0 |
| 0.9666666666666667 | 0 |
| 0.967361111111111 | 0 |
| 0.9680555555555556 | 0 |
| 0.96875 | 0 |
| 0.9694444444444444 | 0 |
| 0.970138888888889 | 0 |
| 0.9708333333333333 | 0 |
| 0.9715277777777778 | 0 |
| 0.9722222222222222 | 0 |
| 0.9729166666666668 | 0 |
| 0.9736111111111111 | 0 |
| 0.9743055555555555 | 0 |
| 0.975 | 0 |
| 0.9756944444444445 | 0 |
| 0.9763888888888889 | 0 |
| 0.9770833333333333 | 0 |
| 0.9777777777777777 | 0 |
| 0.9784722222222223 | 0 |
| 0.9791666666666666 | 0 |
| 0.9798611111111111 | 0 |
| 0.9805555555555556 | 0 |
| 0.9812500000000001 | 0 |
| 0.9819444444444444 | 0 |
| 0.9826388888888888 | 0 |
| 0.9833333333333334 | 0 |
| 0.9840277777777778 | 0 |
| 0.9847222222222222 | 0 |
| 0.9854166666666666 | 0 |
| 0.9861111111111112 | 0 |
| 0.9868055555555556 | 0 |
| 0.9874999999999999 | 0 |
| 0.9881944444444444 | 0 |
| 0.9888888888888889 | 0 |
| 0.9895833333333334 | 0 |
| 0.9902777777777777 | 0 |
| 0.9909722222222223 | 0 |
| 0.9916666666666667 | 0 |
| 0.9923611111111111 | 0 |
| 0.9930555555555555 | 0 |
| 0.99375 | 0 |
| 0.9944444444444445 | 0 |
| 0.9951388888888889 | 0 |
| 0.9958333333333332 | 0 |
| 0.9965277777777778 | 0 |
| 0.9972222222222222 | 0 |
| 0.9979166666666667 | 0 |
| 0.998611111111111 | 0 |
| 0.9993055555555556 | 0 |